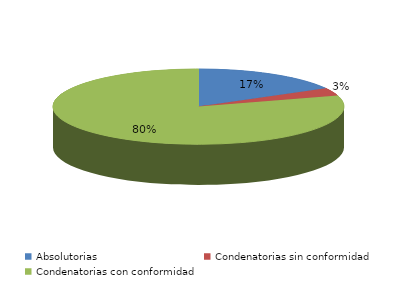
| Category | Series 0 |
|---|---|
| Absolutorias | 31 |
| Condenatorias sin conformidad | 6 |
| Condenatorias con conformidad | 146 |